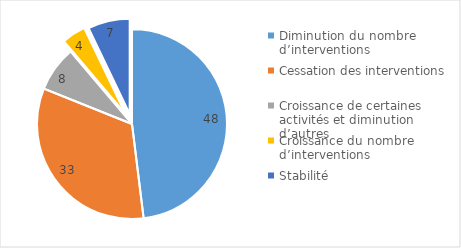
| Category | Series 0 |
|---|---|
| Diminution du nombre d’interventions | 47.68 |
| Cessation des interventions | 32.79 |
| Croissance de certaines activités et diminution d’autres | 7.68 |
| Croissance du nombre d’interventions | 4.04 |
| Stabilité  | 7.06 |